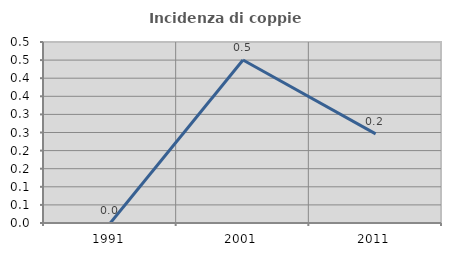
| Category | Incidenza di coppie miste |
|---|---|
| 1991.0 | 0 |
| 2001.0 | 0.45 |
| 2011.0 | 0.246 |